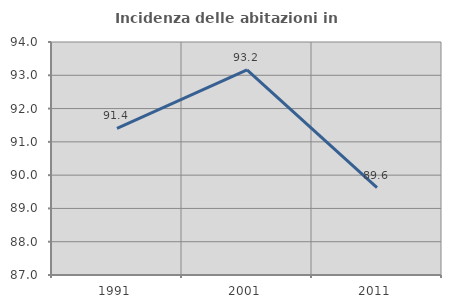
| Category | Incidenza delle abitazioni in proprietà  |
|---|---|
| 1991.0 | 91.406 |
| 2001.0 | 93.162 |
| 2011.0 | 89.623 |